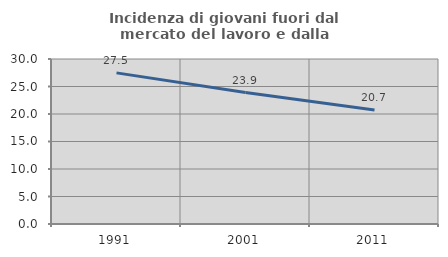
| Category | Incidenza di giovani fuori dal mercato del lavoro e dalla formazione  |
|---|---|
| 1991.0 | 27.477 |
| 2001.0 | 23.896 |
| 2011.0 | 20.72 |